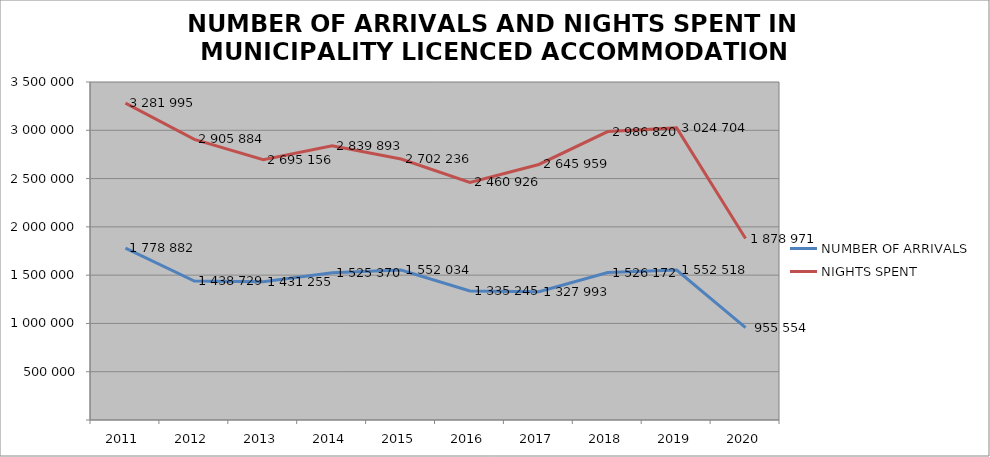
| Category | NUMBER OF ARRIVALS | NIGHTS SPENT |
|---|---|---|
| 2011 | 1778882 | 3281995 |
| 2012 | 1438729 | 2905884 |
| 2013 | 1431255 | 2695156 |
| 2014 | 1525370 | 2839893 |
| 2015 | 1552034 | 2702236 |
| 2016 | 1335245 | 2460926 |
| 2017 | 1327993 | 2645959 |
| 2018 | 1526172 | 2986820 |
| 2019 | 1552518 | 3024704 |
| 2020 | 955554 | 1878971 |